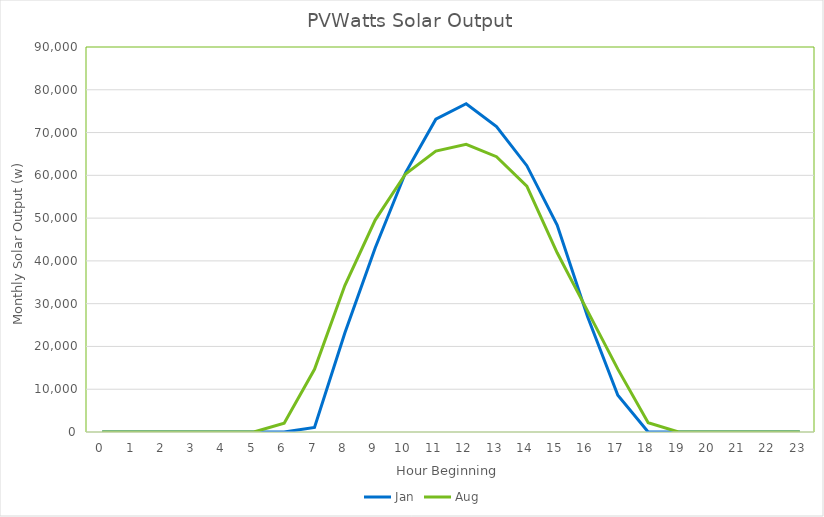
| Category | Jan | Aug |
|---|---|---|
| 0.0 | 0 | 0 |
| 1.0 | 0 | 0 |
| 2.0 | 0 | 0 |
| 3.0 | 0 | 0 |
| 4.0 | 0 | 0 |
| 5.0 | 0 | 0 |
| 6.0 | 0 | 2035.997 |
| 7.0 | 1055.567 | 14651.598 |
| 8.0 | 23127.85 | 34223.955 |
| 9.0 | 43010.017 | 49540.124 |
| 10.0 | 60592.506 | 60303.343 |
| 11.0 | 73113.369 | 65663.979 |
| 12.0 | 76740.513 | 67268.465 |
| 13.0 | 71387.287 | 64365.584 |
| 14.0 | 62255.101 | 57461.952 |
| 15.0 | 48385.935 | 41890.24 |
| 16.0 | 27011.61 | 28320.779 |
| 17.0 | 8591.795 | 14696.854 |
| 18.0 | 0 | 2166.024 |
| 19.0 | 0 | 0 |
| 20.0 | 0 | 0 |
| 21.0 | 0 | 0 |
| 22.0 | 0 | 0 |
| 23.0 | 0 | 0 |